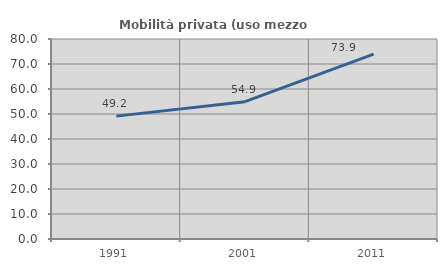
| Category | Mobilità privata (uso mezzo privato) |
|---|---|
| 1991.0 | 49.153 |
| 2001.0 | 54.915 |
| 2011.0 | 73.921 |